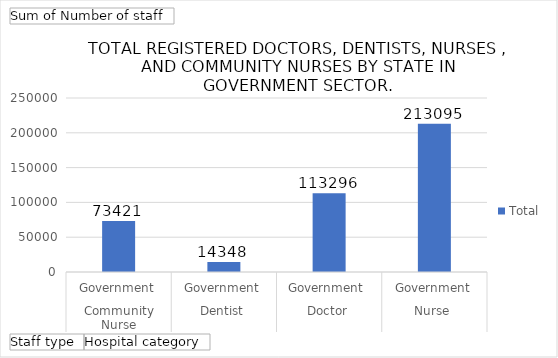
| Category | Total |
|---|---|
| 0 | 73421 |
| 1 | 14348 |
| 2 | 113296 |
| 3 | 213095 |